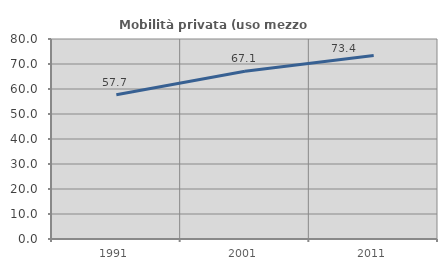
| Category | Mobilità privata (uso mezzo privato) |
|---|---|
| 1991.0 | 57.716 |
| 2001.0 | 67.063 |
| 2011.0 | 73.39 |